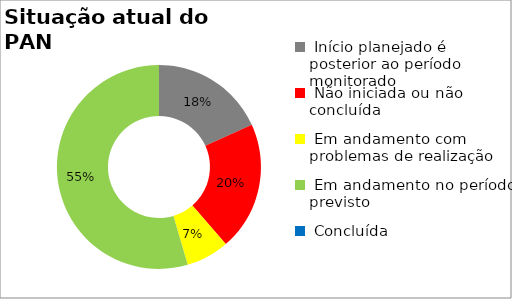
| Category | Series 0 |
|---|---|
|  Início planejado é posterior ao período monitorado | 0.182 |
|  Não iniciada ou não concluída | 0.205 |
|  Em andamento com problemas de realização | 0.068 |
|  Em andamento no período previsto  | 0.545 |
|  Concluída | 0 |